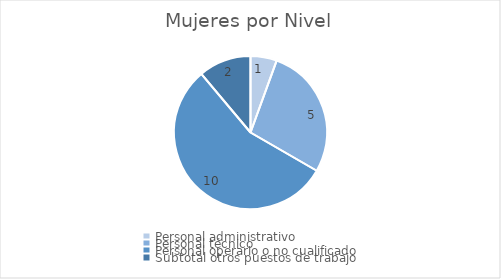
| Category | Nº mujeres en ese nivel |
|---|---|
| Personal administrativo | 1 |
| Personal técnico  | 5 |
| Personal operario o no cualificado  | 10 |
| Subtotal otros puestos de trabajo | 2 |